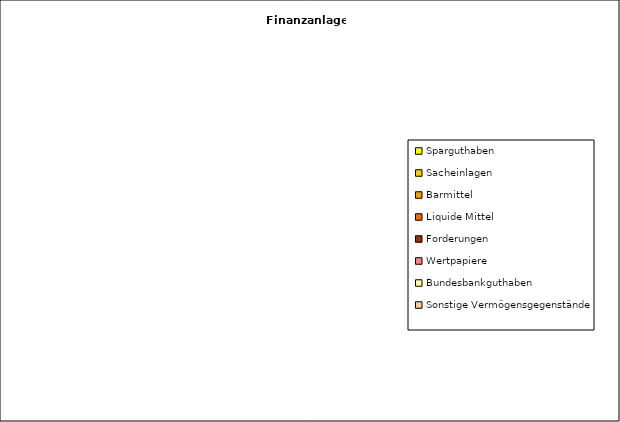
| Category | Series 0 | Series 1 |
|---|---|---|
| Sparguthaben | 0 |  |
| Sacheinlagen | 0 |  |
| Barmittel | 0 |  |
| Liquide Mittel | 0 |  |
| Forderungen | 0 |  |
| Wertpapiere | 0 |  |
| Bundesbankguthaben | 0 |  |
| Sonstige Vermögensgegenstände | 0 |  |